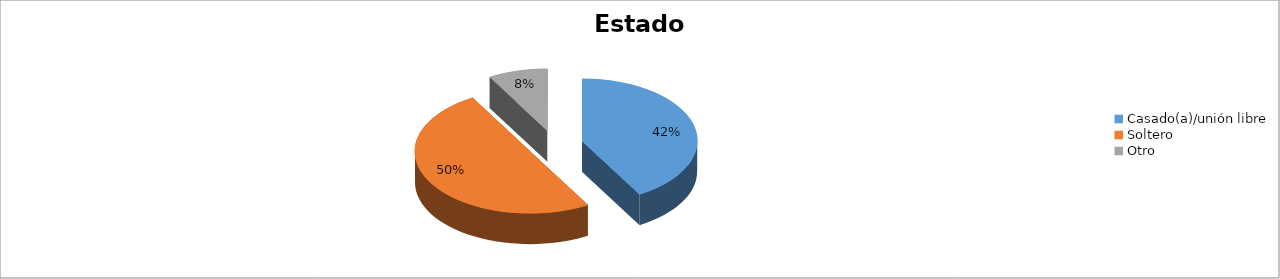
| Category | Series 0 |
|---|---|
| Casado(a)/unión libre | 0.417 |
| Soltero | 0.5 |
| Otro | 0.083 |